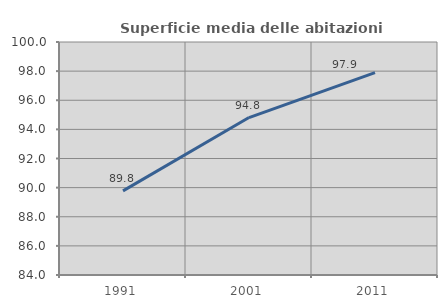
| Category | Superficie media delle abitazioni occupate |
|---|---|
| 1991.0 | 89.777 |
| 2001.0 | 94.813 |
| 2011.0 | 97.899 |